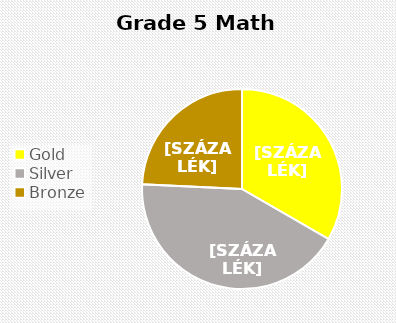
| Category | Series 0 |
|---|---|
| Gold | 11 |
| Silver | 14 |
| Bronze  | 8 |